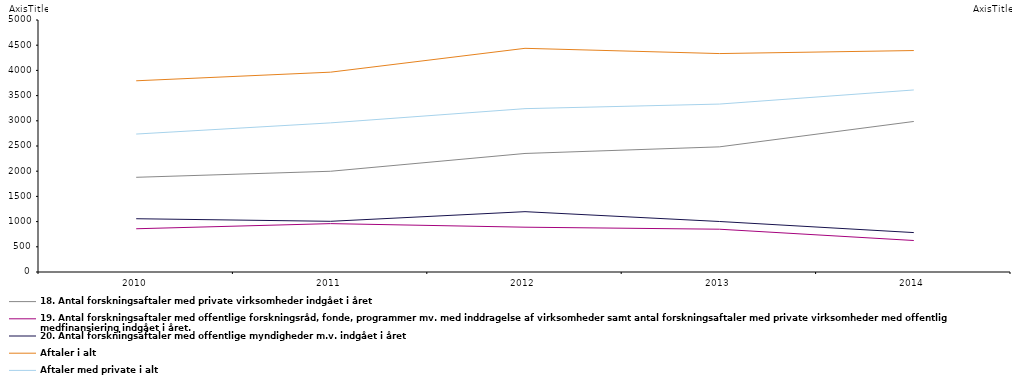
| Category | 18. Antal forskningsaftaler med private virksomheder indgået i året | 19. Antal forskningsaftaler med offentlige forskningsråd, fonde, programmer mv. med inddragelse af virksomheder samt antal forskningsaftaler med private virksomheder med offentlig medfinansiering indgået i året. | 20. Antal forskningsaftaler med offentlige myndigheder m.v. indgået i året | Aftaler i alt  | Aftaler med private i alt  |
|---|---|---|---|---|---|
| 2010.0 | 1879 | 858 | 1057 | 3794 | 2737 |
| 2011.0 | 1999 | 960 | 1006 | 3965 | 2959 |
| 2012.0 | 2352 | 889 | 1197 | 4438 | 3241 |
| 2013.0 | 2483 | 849 | 1002 | 4334 | 3332 |
| 2014.0 | 2987 | 625 | 782 | 4394 | 3612 |